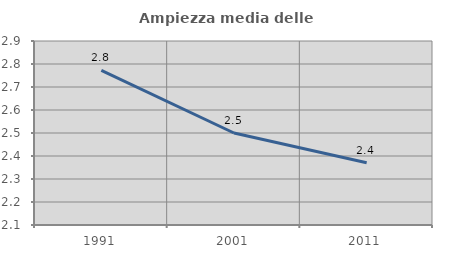
| Category | Ampiezza media delle famiglie |
|---|---|
| 1991.0 | 2.772 |
| 2001.0 | 2.5 |
| 2011.0 | 2.37 |